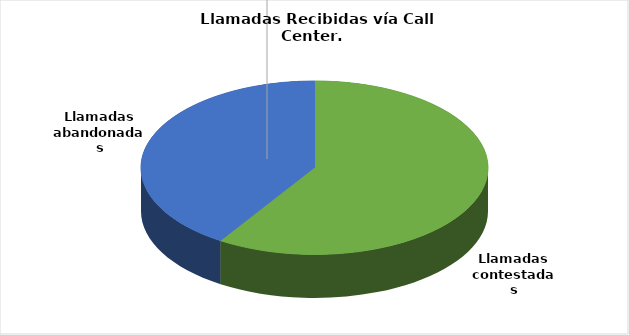
| Category | Enero-Diciembre |
|---|---|
| Llamadas contestadas | 201253 |
| Llamadas abandonadas | 139311 |